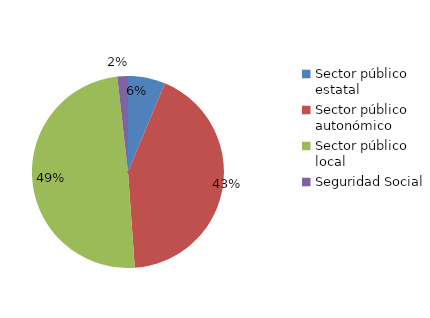
| Category | Series 0 |
|---|---|
| Sector público estatal | 14 |
| Sector público autonómico | 95 |
| Sector público local | 110 |
| Seguridad Social | 4 |